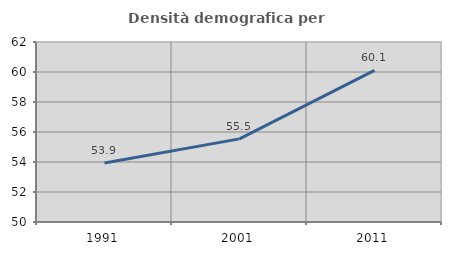
| Category | Densità demografica |
|---|---|
| 1991.0 | 53.927 |
| 2001.0 | 55.543 |
| 2011.0 | 60.111 |